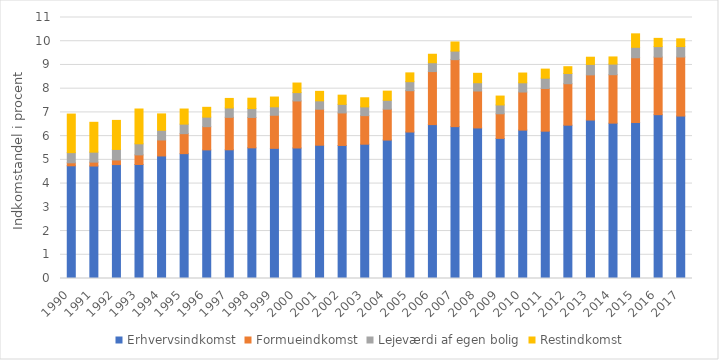
| Category | Erhvervsindkomst | Formueindkomst | Lejeværdi af egen bolig | Restindkomst |
|---|---|---|---|---|
| 1990 | 4.75 | 0.126 | 0.428 | 1.625 |
| 1991 | 4.741 | 0.163 | 0.421 | 1.258 |
| 1992 | 4.801 | 0.193 | 0.445 | 1.225 |
| 1993 | 4.806 | 0.404 | 0.466 | 1.467 |
| 1994 | 5.165 | 0.673 | 0.409 | 0.689 |
| 1995 | 5.262 | 0.841 | 0.402 | 0.637 |
| 1996 | 5.421 | 0.979 | 0.402 | 0.413 |
| 1997 | 5.424 | 1.369 | 0.394 | 0.402 |
| 1998 | 5.507 | 1.281 | 0.374 | 0.438 |
| 1999 | 5.486 | 1.393 | 0.358 | 0.412 |
| 2000 | 5.501 | 1.983 | 0.351 | 0.403 |
| 2001 | 5.617 | 1.518 | 0.353 | 0.4 |
| 2002 | 5.607 | 1.37 | 0.362 | 0.388 |
| 2003 | 5.66 | 1.204 | 0.369 | 0.384 |
| 2004 | 5.834 | 1.303 | 0.373 | 0.386 |
| 2005 | 6.173 | 1.741 | 0.38 | 0.371 |
| 2006 | 6.486 | 2.236 | 0.373 | 0.357 |
| 2007 | 6.401 | 2.823 | 0.36 | 0.384 |
| 2008 | 6.345 | 1.558 | 0.348 | 0.397 |
| 2009 | 5.905 | 1.036 | 0.373 | 0.374 |
| 2010 | 6.254 | 1.606 | 0.389 | 0.412 |
| 2011 | 6.209 | 1.8 | 0.434 | 0.382 |
| 2012 | 6.462 | 1.746 | 0.432 | 0.285 |
| 2013 | 6.678 | 1.904 | 0.442 | 0.302 |
| 2014 | 6.548 | 2.041 | 0.448 | 0.3 |
| 2015 | 6.576 | 2.728 | 0.44 | 0.568 |
| 2016 | 6.904 | 2.427 | 0.442 | 0.347 |
| 2017 | 6.847 | 2.488 | 0.44 | 0.325 |